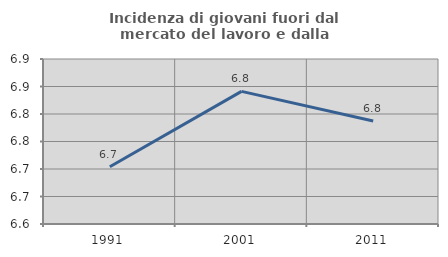
| Category | Incidenza di giovani fuori dal mercato del lavoro e dalla formazione  |
|---|---|
| 1991.0 | 6.704 |
| 2001.0 | 6.841 |
| 2011.0 | 6.787 |